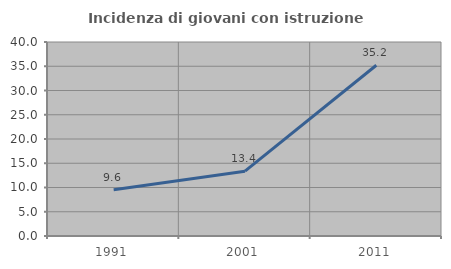
| Category | Incidenza di giovani con istruzione universitaria |
|---|---|
| 1991.0 | 9.551 |
| 2001.0 | 13.364 |
| 2011.0 | 35.211 |